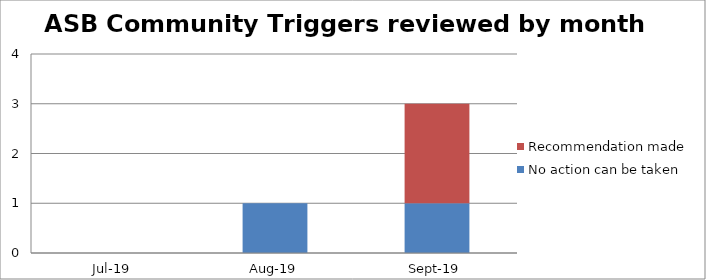
| Category | No action can be taken | Recommendation made |
|---|---|---|
| 2019-07-01 | 0 | 0 |
| 2019-08-01 | 1 | 0 |
| 2019-09-01 | 1 | 2 |